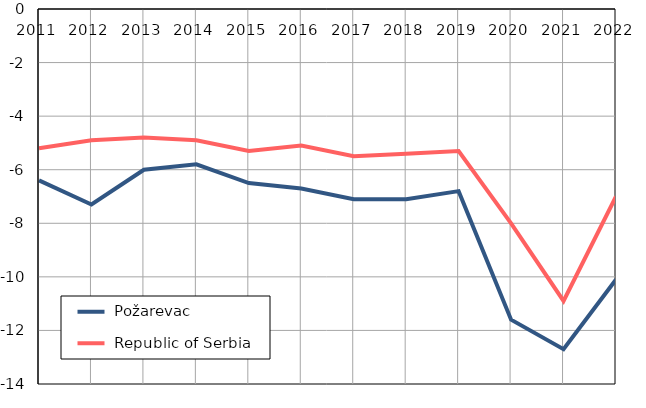
| Category |  Požarevac |  Republic of Serbia |
|---|---|---|
| 2011.0 | -6.4 | -5.2 |
| 2012.0 | -7.3 | -4.9 |
| 2013.0 | -6 | -4.8 |
| 2014.0 | -5.8 | -4.9 |
| 2015.0 | -6.5 | -5.3 |
| 2016.0 | -6.7 | -5.1 |
| 2017.0 | -7.1 | -5.5 |
| 2018.0 | -7.1 | -5.4 |
| 2019.0 | -6.8 | -5.3 |
| 2020.0 | -11.6 | -8 |
| 2021.0 | -12.7 | -10.9 |
| 2022.0 | -10.1 | -7 |